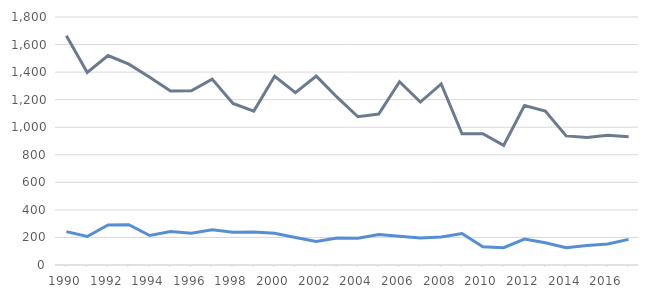
| Category | Series 0 | AirNewRecruits |
|---|---|---|
| 1990.0 | 1664 | 242 |
| 1991.0 | 1398 | 207 |
| 1992.0 | 1520 | 291 |
| 1993.0 | 1458 | 293 |
| 1994.0 | 1362 | 214 |
| 1995.0 | 1263 | 243 |
| 1996.0 | 1265 | 231 |
| 1997.0 | 1349 | 256 |
| 1998.0 | 1173 | 237 |
| 1999.0 | 1117 | 240 |
| 2000.0 | 1370 | 230 |
| 2001.0 | 1251 | 200 |
| 2002.0 | 1371 | 170 |
| 2003.0 | 1218 | 196 |
| 2004.0 | 1076 | 195 |
| 2005.0 | 1096 | 222 |
| 2006.0 | 1330 | 208 |
| 2007.0 | 1183 | 196 |
| 2008.0 | 1314 | 203 |
| 2009.0 | 952 | 228 |
| 2010.0 | 953 | 133 |
| 2011.0 | 868 | 126 |
| 2012.0 | 1157 | 188 |
| 2013.0 | 1117 | 161 |
| 2014.0 | 937 | 126 |
| 2015.0 | 926 | 142 |
| 2016.0 | 941 | 152 |
| 2017.0 | 930 | 186 |